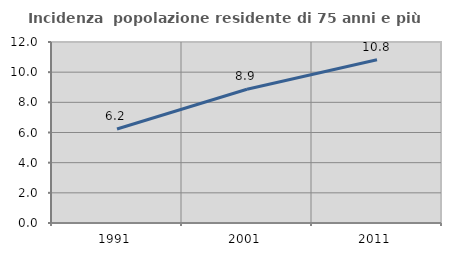
| Category | Incidenza  popolazione residente di 75 anni e più |
|---|---|
| 1991.0 | 6.234 |
| 2001.0 | 8.867 |
| 2011.0 | 10.823 |